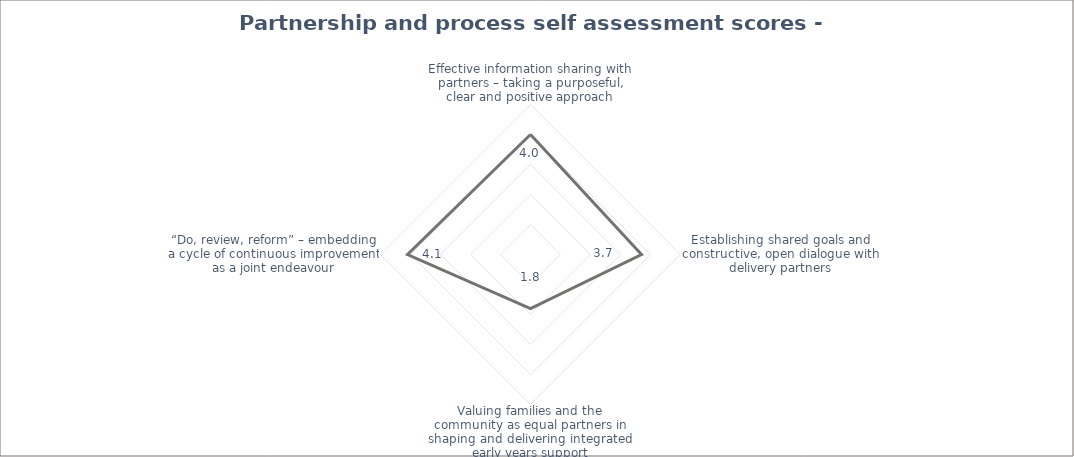
| Category | Series 0 |
|---|---|
| Effective information sharing with partners – taking a purposeful, clear and positive approach | 4 |
| Establishing shared goals and constructive, open dialogue with delivery partners | 3.7 |
| Valuing families and the community as equal partners in shaping and delivering integrated early years support | 1.8 |
| “Do, review, reform” – embedding a cycle of continuous improvement as a joint endeavour | 4.1 |